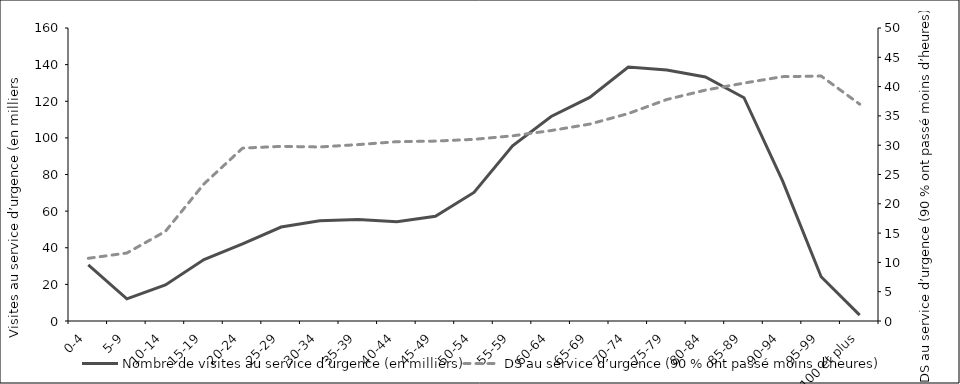
| Category | Nombre de visites au service d’urgence (en milliers) |
|---|---|
| 0-4 | 30.628 |
| 5-9 | 12.076 |
| 10-14 | 19.713 |
| 15-19 | 33.572 |
| 20-24 | 42.141 |
| 25-29 | 51.305 |
| 30-34 | 54.722 |
| 35-39 | 55.432 |
| 40-44 | 54.215 |
| 45-49 | 57.184 |
| 50-54 | 70.192 |
| 55-59 | 95.635 |
| 60-64 | 111.676 |
| 65-69 | 122.117 |
| 70-74 | 138.679 |
| 75-79 | 137.045 |
| 80-84 | 133.269 |
| 85-89 | 121.927 |
| 90-94 | 76.525 |
| 95-99 | 24.179 |
| 100 et plus | 3.223 |